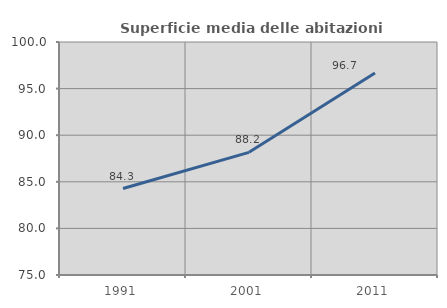
| Category | Superficie media delle abitazioni occupate |
|---|---|
| 1991.0 | 84.275 |
| 2001.0 | 88.163 |
| 2011.0 | 96.667 |